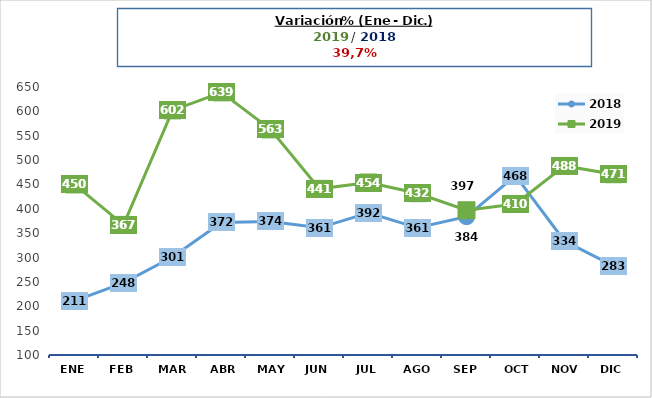
| Category | 2018 | 2019 |
|---|---|---|
| Ene | 211 | 450 |
| Feb | 248 | 367 |
| Mar | 301 | 602 |
| Abr | 372 | 639 |
| May | 374 | 563 |
| Jun | 361 | 441 |
| Jul | 392 | 454 |
| Ago | 361 | 432 |
| Sep | 384 | 397 |
| Oct | 468 | 410 |
| Nov | 334 | 488 |
| Dic | 283 | 471 |